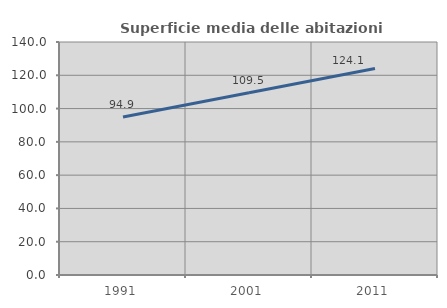
| Category | Superficie media delle abitazioni occupate |
|---|---|
| 1991.0 | 94.934 |
| 2001.0 | 109.451 |
| 2011.0 | 124.067 |